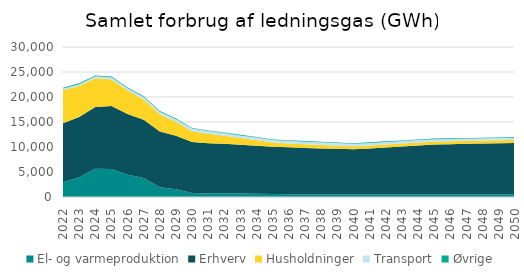
| Category | El- og varmeproduktion | Erhverv | Husholdninger | Transport | Øvrige |
|---|---|---|---|---|---|
| 2022.0 | 2966.74 | 11768.36 | 6610.58 | 333.34 | 175.357 |
| 2023.0 | 3962.11 | 12049.74 | 6183.97 | 356.09 | 174.244 |
| 2024.0 | 5659.18 | 12331.15 | 5757.37 | 385.44 | 173.13 |
| 2025.0 | 5579.14 | 12612.5 | 5330.76 | 416.17 | 172.017 |
| 2026.0 | 4470.53 | 12126.92 | 4699.88 | 448.97 | 165.132 |
| 2027.0 | 3811.65 | 11641.31 | 4068.98 | 475.23 | 158.247 |
| 2028.0 | 1944.07 | 11155.72 | 3438.08 | 495.64 | 151.362 |
| 2029.0 | 1569.76 | 10670.13 | 2807.19 | 509.31 | 144.477 |
| 2030.0 | 810.56 | 10184.53 | 2176.29 | 513.5 | 137.592 |
| 2031.0 | 715.43 | 10037.96 | 1905.64 | 516.14 | 134.934 |
| 2032.0 | 735.44 | 9891.34 | 1634.97 | 518.54 | 132.276 |
| 2033.0 | 681.5 | 9744.74 | 1364.32 | 520.29 | 129.618 |
| 2034.0 | 664.57 | 9598.16 | 1093.65 | 522.1 | 126.96 |
| 2035.0 | 601.98 | 9451.54 | 823 | 520.6 | 124.302 |
| 2036.0 | 572.16 | 9358.96 | 778.4 | 521.61 | 123.352 |
| 2037.0 | 550.99 | 9266.34 | 733.8 | 517.74 | 122.403 |
| 2038.0 | 550.16 | 9173.75 | 689.2 | 512.53 | 121.453 |
| 2039.0 | 547.41 | 9081.17 | 644.6 | 506.35 | 120.504 |
| 2040.0 | 546.67 | 8988.55 | 600 | 497.08 | 119.554 |
| 2041.0 | 537.28 | 9181.45 | 600.15 | 490.65 | 120.82 |
| 2042.0 | 547.13 | 9374.38 | 600.29 | 483.9 | 122.085 |
| 2043.0 | 543.11 | 9567.25 | 600.44 | 477.48 | 123.35 |
| 2044.0 | 545.9 | 9760.17 | 600.59 | 471.04 | 124.616 |
| 2045.0 | 541.63 | 9953.07 | 600.73 | 464.56 | 125.881 |
| 2046.0 | 542.65 | 10019.66 | 600.82 | 458.01 | 126.363 |
| 2047.0 | 540.46 | 10086.26 | 600.92 | 451.36 | 126.845 |
| 2048.0 | 539.9 | 10152.84 | 601.01 | 444.59 | 127.327 |
| 2049.0 | 534.79 | 10219.4 | 601.11 | 437.87 | 127.808 |
| 2050.0 | 533.78 | 10286.03 | 601.2 | 430.16 | 128.29 |